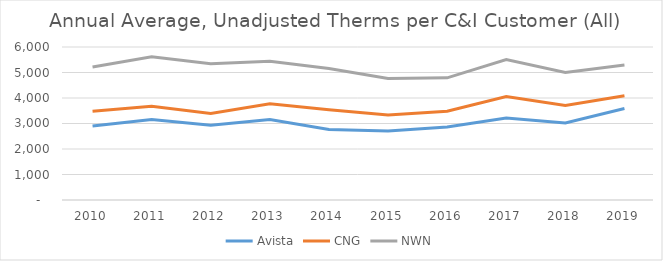
| Category | Avista | CNG | NWN |
|---|---|---|---|
| 2010.0 | 2899.982 | 3481.776 | 5213.623 |
| 2011.0 | 3158.899 | 3676.564 | 5613.762 |
| 2012.0 | 2934.629 | 3389.871 | 5347.531 |
| 2013.0 | 3153.52 | 3773.977 | 5438.25 |
| 2014.0 | 2761.413 | 3542.027 | 5158.338 |
| 2015.0 | 2708.446 | 3331.722 | 4764.366 |
| 2016.0 | 2862.881 | 3484.598 | 4789.591 |
| 2017.0 | 3216.164 | 4054.533 | 5506.205 |
| 2018.0 | 3023.539 | 3707.695 | 4998.509 |
| 2019.0 | 3585.251 | 4086.201 | 5296.861 |